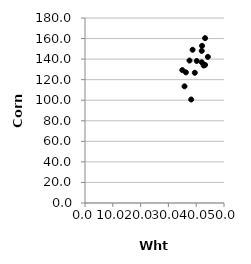
| Category | Series 0 |
|---|---|
| 38.2 | 100.7 |
| 37.6 | 138.6 |
| 35.8 | 113.5 |
| 36.3 | 127.1 |
| 39.5 | 126.7 |
| 43.2 | 134.4 |
| 42.7 | 133.8 |
| 42.0 | 136.9 |
| 40.2 | 138.2 |
| 35.0 | 129.3 |
| 44.2 | 142.2 |
| 43.2 | 160.4 |
| 42.0 | 148 |
| 38.7 | 149.1 |
| 42.1 | 152.9 |